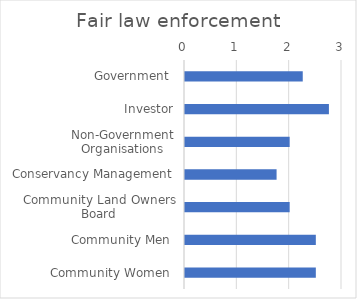
| Category | Fair law enforcement |
|---|---|
| Government  | 2.25 |
| Investor | 2.75 |
| Non-Government Organisations | 2 |
| Conservancy Management | 1.75 |
| Community Land Owners Board | 2 |
| Community Men  | 2.5 |
| Community Women  | 2.5 |